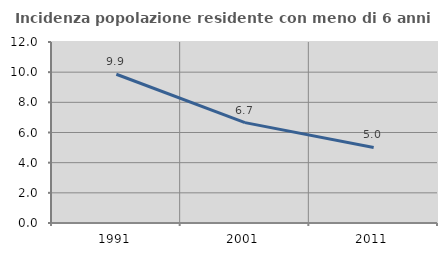
| Category | Incidenza popolazione residente con meno di 6 anni |
|---|---|
| 1991.0 | 9.862 |
| 2001.0 | 6.653 |
| 2011.0 | 5.01 |